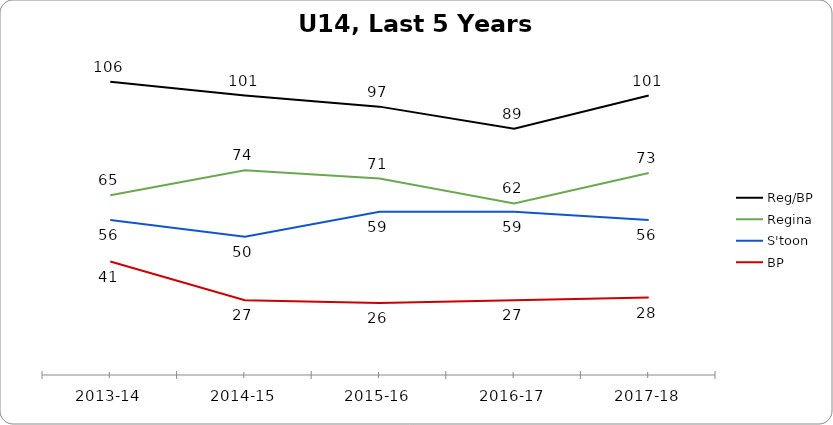
| Category | Reg/BP | Regina | S'toon | BP |
|---|---|---|---|---|
| 2013-14 | 106 | 65 | 56 | 41 |
| 2014-15 | 101 | 74 | 50 | 27 |
| 2015-16 | 97 | 71 | 59 | 26 |
| 2016-17 | 89 | 62 | 59 | 27 |
| 2017-18 | 101 | 73 | 56 | 28 |